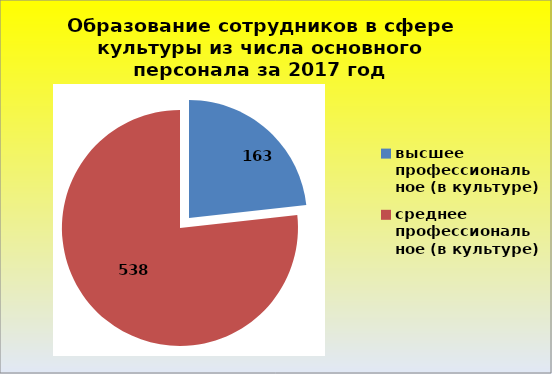
| Category | Series 0 |
|---|---|
| высшее профессиональное (в культуре) | 163 |
| среднее профессиональное (в культуре) | 538 |